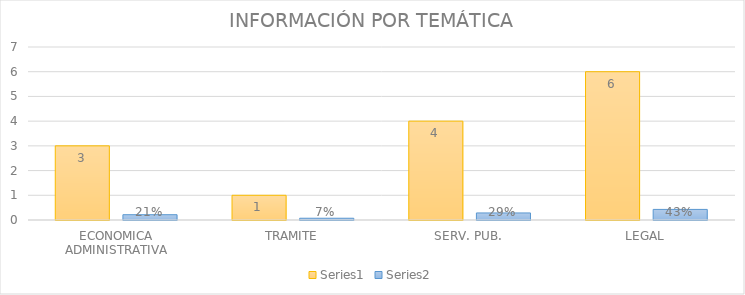
| Category | Series 3 | Series 4 |
|---|---|---|
| ECONOMICA ADMINISTRATIVA | 3 | 0.214 |
| TRAMITE | 1 | 0.071 |
| SERV. PUB. | 4 | 0.286 |
| LEGAL | 6 | 0.429 |